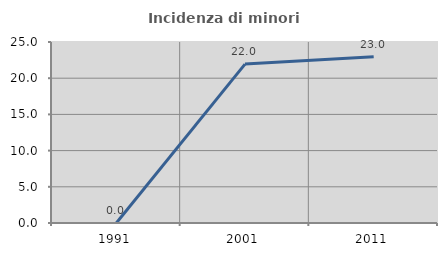
| Category | Incidenza di minori stranieri |
|---|---|
| 1991.0 | 0 |
| 2001.0 | 21.951 |
| 2011.0 | 22.973 |